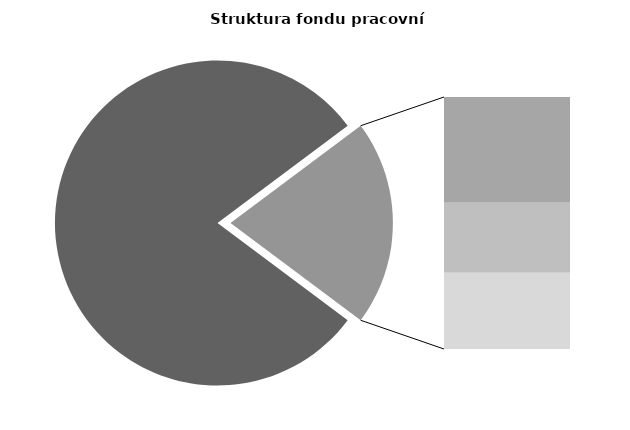
| Category | Series 0 |
|---|---|
| Průměrná měsíční odpracovaná doba bez přesčasu | 134.975 |
| Dovolená | 14.546 |
| Nemoc | 9.624 |
| Jiné | 10.475 |